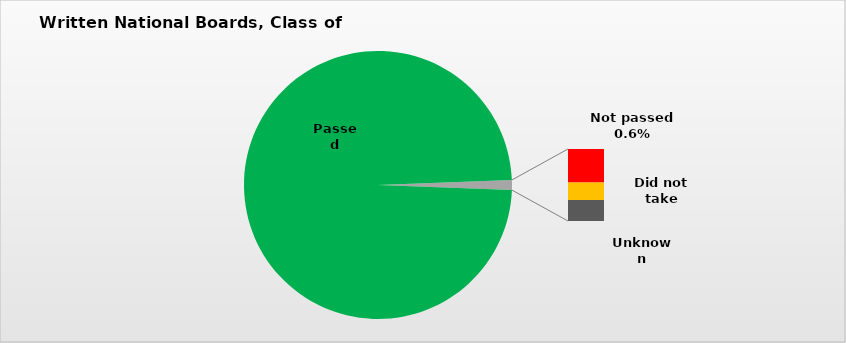
| Category | Series 0 |
|---|---|
| Passed | 0.988 |
| Not passed  | 0.006 |
| Did not take | 0.003 |
| Unknown | 0.003 |